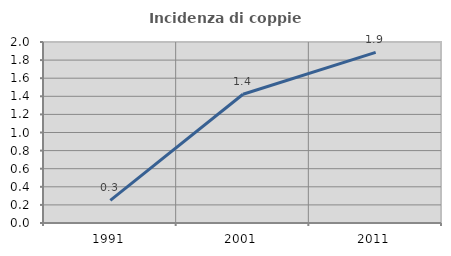
| Category | Incidenza di coppie miste |
|---|---|
| 1991.0 | 0.251 |
| 2001.0 | 1.423 |
| 2011.0 | 1.885 |